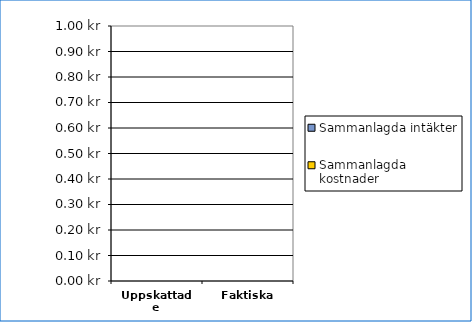
| Category | Sammanlagda intäkter | Sammanlagda kostnader |
|---|---|---|
| Uppskattade | 0 | 0 |
| Faktiska | 0 | 0 |